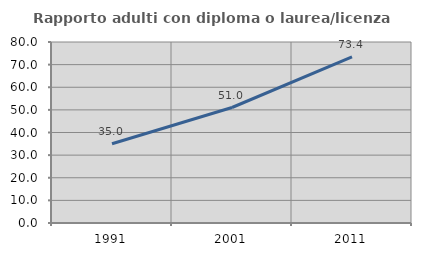
| Category | Rapporto adulti con diploma o laurea/licenza media  |
|---|---|
| 1991.0 | 35.012 |
| 2001.0 | 51.049 |
| 2011.0 | 73.415 |